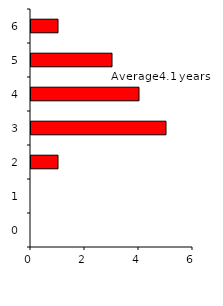
| Category | Series 0 |
|---|---|
| 0.0 | 0 |
| 1.0 | 0 |
| 2.0 | 1 |
| 3.0 | 5 |
| 4.0 | 4 |
| 5.0 | 3 |
| 6.0 | 1 |